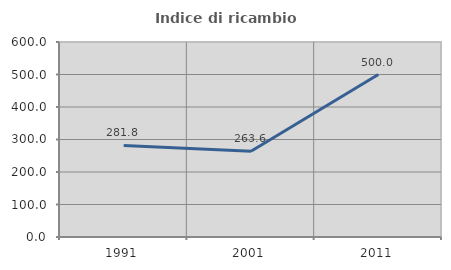
| Category | Indice di ricambio occupazionale  |
|---|---|
| 1991.0 | 281.818 |
| 2001.0 | 263.636 |
| 2011.0 | 500 |